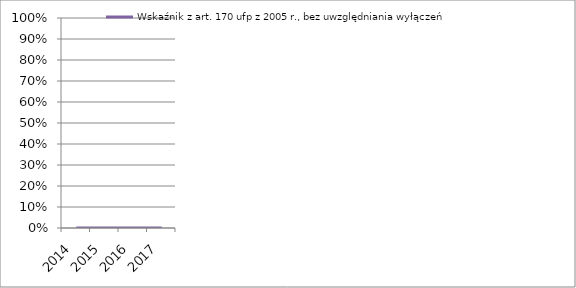
| Category | Wskaźnik z art. 170 ufp z 2005 r., bez uwzględniania wyłączeń |
|---|---|
| 2014.0 | 0 |
| 2015.0 | 0 |
| 2016.0 | 0 |
| 2017.0 | 0 |